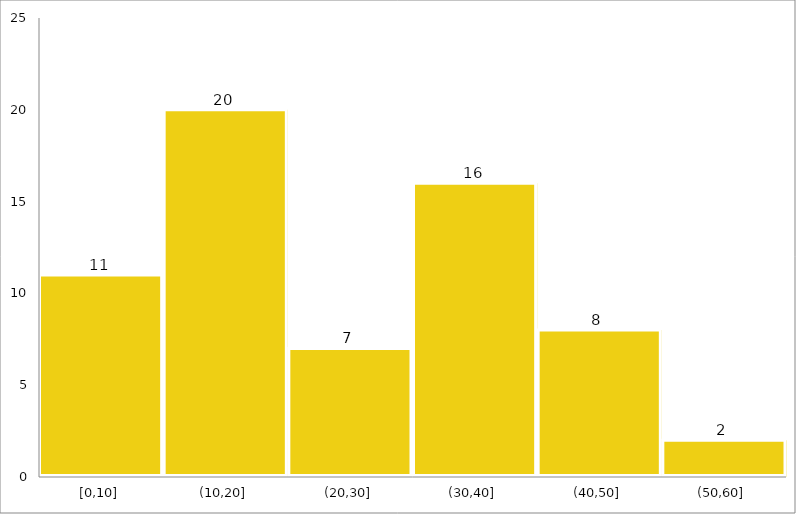
| Category | Series 0 |
|---|---|
| 0 | 52 |
| 1 | 51 |
| 2 | 49 |
| 3 | 47 |
| 4 | 45 |
| 5 | 44 |
| 6 | 43 |
| 7 | 43 |
| 8 | 42 |
| 9 | 41 |
| 10 | 40 |
| 11 | 40 |
| 12 | 40 |
| 13 | 40 |
| 14 | 40 |
| 15 | 40 |
| 16 | 39 |
| 17 | 39 |
| 18 | 39 |
| 19 | 38 |
| 20 | 37 |
| 21 | 36 |
| 22 | 36 |
| 23 | 36 |
| 24 | 33 |
| 25 | 32 |
| 26 | 30 |
| 27 | 30 |
| 28 | 30 |
| 29 | 28 |
| 30 | 28 |
| 31 | 23 |
| 32 | 22 |
| 33 | 20 |
| 34 | 19 |
| 35 | 19 |
| 36 | 17 |
| 37 | 18 |
| 38 | 17 |
| 39 | 18 |
| 40 | 17 |
| 41 | 17 |
| 42 | 16 |
| 43 | 16 |
| 44 | 13 |
| 45 | 12 |
| 46 | 12 |
| 47 | 12 |
| 48 | 12 |
| 49 | 11 |
| 50 | 11 |
| 51 | 11 |
| 52 | 11 |
| 53 | 10 |
| 54 | 7 |
| 55 | 7 |
| 56 | 7 |
| 57 | 5 |
| 58 | 3 |
| 59 | 3 |
| 60 | 1 |
| 61 | 0 |
| 62 | 0 |
| 63 | 0 |